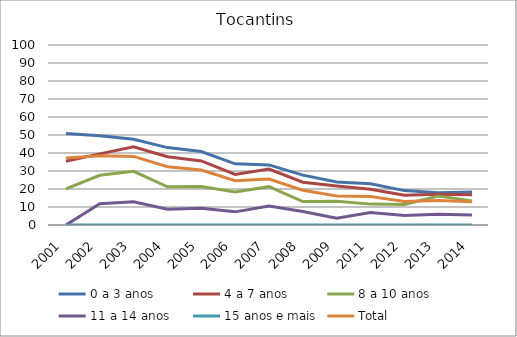
| Category | 0 a 3 anos | 4 a 7 anos | 8 a 10 anos | 11 a 14 anos | 15 anos e mais | Total |
|---|---|---|---|---|---|---|
| 2001.0 | 50.9 | 35.4 | 20.1 | 0 | 0 | 37.2 |
| 2002.0 | 49.6 | 39.5 | 27.6 | 11.8 | 0 | 38.5 |
| 2003.0 | 47.6 | 43.5 | 29.8 | 12.9 | 0 | 38.1 |
| 2004.0 | 43 | 37.9 | 21.2 | 8.8 | 0 | 32.4 |
| 2005.0 | 40.8 | 35.6 | 21.4 | 9.3 | 0 | 30.5 |
| 2006.0 | 34 | 28.1 | 18.4 | 7.3 | 0 | 24.6 |
| 2007.0 | 33.4 | 31.1 | 21.3 | 10.6 | 0 | 25.5 |
| 2008.0 | 27.7 | 23.8 | 13 | 7.5 | 0 | 19.3 |
| 2009.0 | 23.9 | 21.7 | 13.2 | 3.7 | 0 | 16.1 |
| 2011.0 | 22.9 | 19.9 | 11.6 | 7 | 0 | 15.8 |
| 2012.0 | 19.1 | 16.5 | 11.4 | 5.3 | 0 | 13.1 |
| 2013.0 | 17.9 | 17.1 | 16.1 | 6 | 0 | 13.6 |
| 2014.0 | 18.3 | 16.8 | 13.4 | 5.5 | 0 | 12.9 |